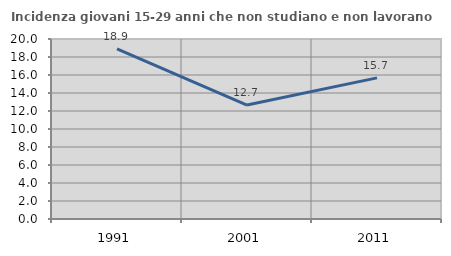
| Category | Incidenza giovani 15-29 anni che non studiano e non lavorano  |
|---|---|
| 1991.0 | 18.912 |
| 2001.0 | 12.658 |
| 2011.0 | 15.679 |